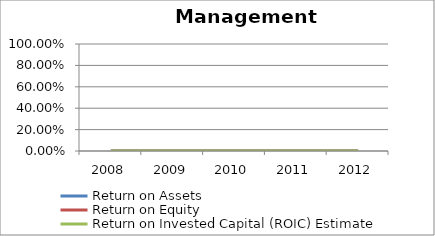
| Category | Return on Assets | Return on Equity | Return on Invested Capital (ROIC) Estimate |
|---|---|---|---|
| 2008.0 | 0 | 0 | 0 |
| 2009.0 | 0 | 0 | 0 |
| 2010.0 | 0 | 0 | 0 |
| 2011.0 | 0 | 0 | 0 |
| 2012.0 | 0 | 0 | 0 |